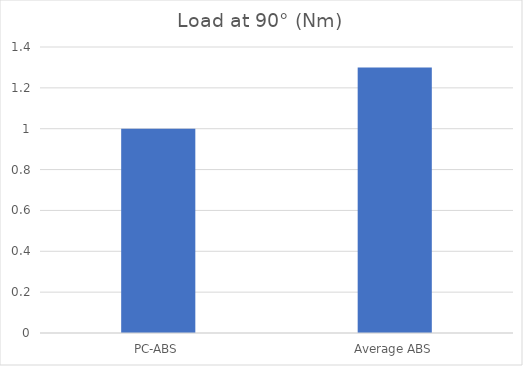
| Category | Load at 90° |
|---|---|
| PC-ABS | 1 |
| Average ABS | 1.3 |